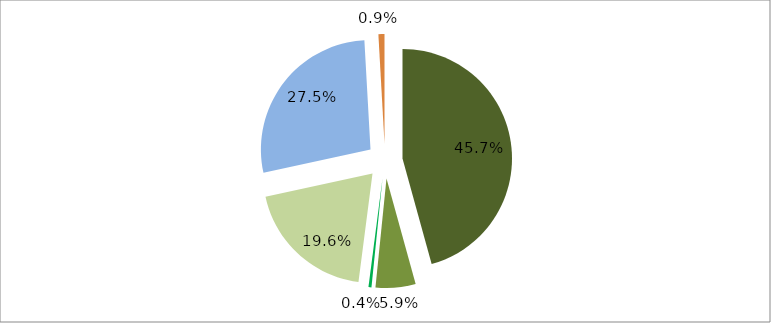
| Category | Series 0 |
|---|---|
| 0 | 0.457 |
| 1 | 0.059 |
| 2 | 0.004 |
| 3 | 0.196 |
| 4 | 0.275 |
| 5 | 0.009 |